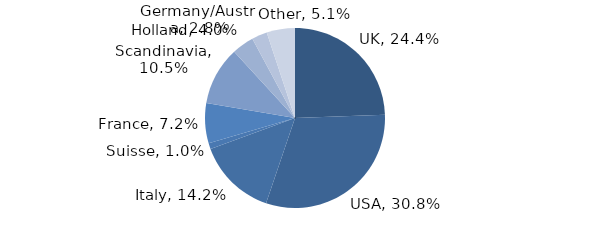
| Category | Investment Style |
|---|---|
| UK | 0.244 |
| USA | 0.308 |
| Italy | 0.142 |
| Suisse | 0.01 |
| France | 0.072 |
| Scandinavia | 0.105 |
| Holland | 0.04 |
| Germany/Austria | 0.028 |
| Other | 0.051 |